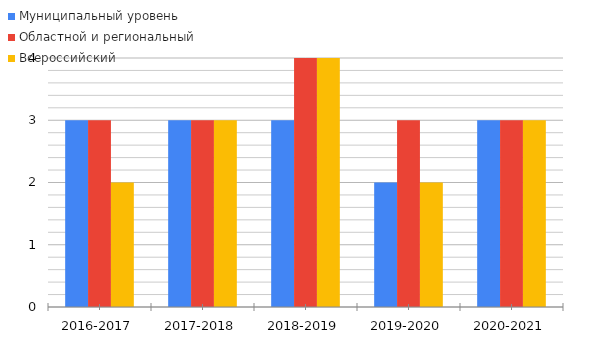
| Category | Муниципальный уровень | Областной и региональный  | Всероссийский  |
|---|---|---|---|
| 2016-2017 | 3 | 3 | 2 |
| 2017-2018 | 3 | 3 | 3 |
| 2018-2019 | 3 | 4 | 4 |
| 2019-2020 | 2 | 3 | 2 |
| 2020-2021 | 3 | 3 | 3 |